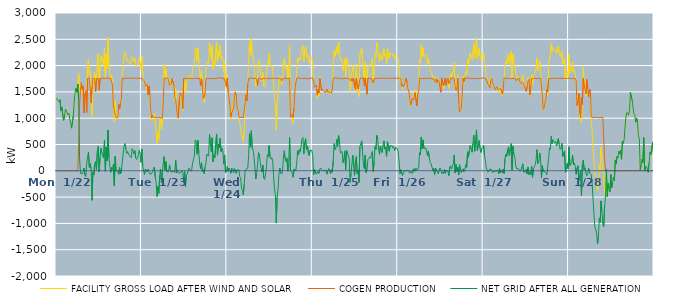
| Category | FACILITY GROSS LOAD AFTER WIND AND SOLAR | COGEN PRODUCTION | NET GRID AFTER ALL GENERATION |
|---|---|---|---|
|  Mon  1/22 | 1385 | 0 | 1385 |
|  Mon  1/22 | 1350 | 0 | 1350 |
|  Mon  1/22 | 1354 | 0 | 1354 |
|  Mon  1/22 | 1310 | 0 | 1310 |
|  Mon  1/22 | 1353 | 0 | 1353 |
|  Mon  1/22 | 1143 | 0 | 1143 |
|  Mon  1/22 | 1215 | 0 | 1215 |
|  Mon  1/22 | 1199 | 0 | 1199 |
|  Mon  1/22 | 960 | 0 | 960 |
|  Mon  1/22 | 1016 | 0 | 1016 |
|  Mon  1/22 | 1170 | 0 | 1170 |
|  Mon  1/22 | 1148 | 0 | 1148 |
|  Mon  1/22 | 1146 | 0 | 1146 |
|  Mon  1/22 | 1063 | 0 | 1063 |
|  Mon  1/22 | 1091 | 0 | 1091 |
|  Mon  1/22 | 979 | 0 | 979 |
|  Mon  1/22 | 912 | 0 | 912 |
|  Mon  1/22 | 810 | 0 | 810 |
|  Mon  1/22 | 827 | 0 | 827 |
|  Mon  1/22 | 1047 | 0 | 1047 |
|  Mon  1/22 | 1327 | 0 | 1327 |
|  Mon  1/22 | 1489 | 0 | 1489 |
|  Mon  1/22 | 1569 | 0 | 1569 |
|  Mon  1/22 | 1495 | 0 | 1495 |
|  Mon  1/22 | 1648 | 0 | 1648 |
|  Mon  1/22 | 1852 | 531 | 1321 |
|  Mon  1/22 | 1490 | 1260 | 230 |
|  Mon  1/22 | 1492 | 1540 | -48 |
|  Mon  1/22 | 1647 | 1676 | -29 |
|  Mon  1/22 | 1485 | 1541 | -56 |
|  Mon  1/22 | 1596 | 1604 | -8 |
|  Mon  1/22 | 1150 | 1098 | 52 |
|  Mon  1/22 | 1390 | 1471 | -81 |
|  Mon  1/22 | 1408 | 1521 | -113 |
|  Mon  1/22 | 1248 | 1110 | 138 |
|  Mon  1/22 | 2019 | 1758 | 261 |
|  Mon  1/22 | 2116 | 1761 | 355 |
|  Mon  1/22 | 1827 | 1762 | 65 |
|  Mon  1/22 | 1892 | 1755 | 137 |
|  Mon  1/22 | 1323 | 1287 | 36 |
|  Mon  1/22 | 1034 | 1597 | -563 |
|  Mon  1/22 | 1738 | 1760 | -22 |
|  Mon  1/22 | 1687 | 1763 | -76 |
|  Mon  1/22 | 1879 | 1754 | 125 |
|  Mon  1/22 | 1680 | 1503 | 177 |
|  Mon  1/22 | 1780 | 1754 | 26 |
|  Mon  1/22 | 2146 | 1763 | 383 |
|  Mon  1/22 | 2225 | 1757 | 468 |
|  Mon  1/22 | 1512 | 1531 | -19 |
|  Mon  1/22 | 2003 | 1753 | 250 |
|  Mon  1/22 | 2180 | 1751 | 429 |
|  Mon  1/22 | 2093 | 1756 | 337 |
|  Mon  1/22 | 2115 | 1760 | 355 |
|  Mon  1/22 | 2004 | 1762 | 242 |
|  Mon  1/22 | 2325 | 1749 | 576 |
|  Mon  1/22 | 1748 | 1756 | -8 |
|  Mon  1/22 | 2215 | 1762 | 453 |
|  Mon  1/22 | 1952 | 1760 | 192 |
|  Mon  1/22 | 2530 | 1754 | 776 |
|  Mon  1/22 | 1993 | 1755 | 238 |
|  Mon  1/22 | 1852 | 1754 | 98 |
|  Mon  1/22 | 1731 | 1760 | -29 |
|  Mon  1/22 | 1819 | 1756 | 63 |
|  Mon  1/22 | 1656 | 1629 | 27 |
|  Mon  1/22 | 1359 | 1232 | 127 |
|  Mon  1/22 | 932 | 1218 | -286 |
|  Mon  1/22 | 1329 | 1057 | 272 |
|  Mon  1/22 | 1012 | 1012 | 0 |
|  Mon  1/22 | 1004 | 1017 | -13 |
|  Mon  1/22 | 1002 | 1017 | -15 |
|  Mon  1/22 | 1202 | 1269 | -67 |
|  Mon  1/22 | 1240 | 1177 | 63 |
|  Mon  1/22 | 1236 | 1295 | -59 |
|  Mon  1/22 | 1386 | 1376 | 10 |
|  Mon  1/22 | 1930 | 1762 | 168 |
|  Mon  1/22 | 1901 | 1749 | 152 |
|  Mon  1/22 | 2225 | 1755 | 470 |
|  Mon  1/22 | 2263 | 1747 | 516 |
|  Mon  1/22 | 2171 | 1759 | 412 |
|  Mon  1/22 | 2084 | 1756 | 328 |
|  Mon  1/22 | 2124 | 1759 | 365 |
|  Mon  1/22 | 2065 | 1755 | 310 |
|  Mon  1/22 | 2077 | 1760 | 317 |
|  Mon  1/22 | 2026 | 1756 | 270 |
|  Mon  1/22 | 2011 | 1763 | 248 |
|  Mon  1/22 | 2179 | 1759 | 420 |
|  Mon  1/22 | 2157 | 1761 | 396 |
|  Mon  1/22 | 2074 | 1752 | 322 |
|  Mon  1/22 | 2139 | 1755 | 384 |
|  Mon  1/22 | 2009 | 1760 | 249 |
|  Mon  1/22 | 1974 | 1759 | 215 |
|  Mon  1/22 | 2004 | 1762 | 242 |
|  Mon  1/22 | 2068 | 1761 | 307 |
|  Mon  1/22 | 2142 | 1756 | 386 |
|  Mon  1/22 | 2085 | 1757 | 328 |
|  Mon  1/22 | 1917 | 1757 | 160 |
|  Tue  1/23 | 2176 | 1761 | 415 |
|  Tue  1/23 | 1845 | 1755 | 90 |
|  Tue  1/23 | 1713 | 1722 | -9 |
|  Tue  1/23 | 1619 | 1688 | -69 |
|  Tue  1/23 | 1642 | 1607 | 35 |
|  Tue  1/23 | 1615 | 1610 | 5 |
|  Tue  1/23 | 1622 | 1644 | -22 |
|  Tue  1/23 | 1477 | 1443 | 34 |
|  Tue  1/23 | 1587 | 1612 | -25 |
|  Tue  1/23 | 1383 | 1448 | -65 |
|  Tue  1/23 | 1084 | 1147 | -63 |
|  Tue  1/23 | 951 | 1003 | -52 |
|  Tue  1/23 | 1042 | 1051 | -9 |
|  Tue  1/23 | 1014 | 1025 | -11 |
|  Tue  1/23 | 1090 | 1018 | 72 |
|  Tue  1/23 | 900 | 1017 | -117 |
|  Tue  1/23 | 796 | 1020 | -224 |
|  Tue  1/23 | 515 | 1004 | -489 |
|  Tue  1/23 | 718 | 1018 | -300 |
|  Tue  1/23 | 585 | 1013 | -428 |
|  Tue  1/23 | 904 | 1006 | -102 |
|  Tue  1/23 | 1042 | 1009 | 33 |
|  Tue  1/23 | 780 | 1012 | -232 |
|  Tue  1/23 | 974 | 1000 | -26 |
|  Tue  1/23 | 1242 | 1268 | -26 |
|  Tue  1/23 | 2030 | 1761 | 269 |
|  Tue  1/23 | 1766 | 1752 | 14 |
|  Tue  1/23 | 1933 | 1760 | 173 |
|  Tue  1/23 | 1741 | 1756 | -15 |
|  Tue  1/23 | 1765 | 1761 | 4 |
|  Tue  1/23 | 1708 | 1727 | -19 |
|  Tue  1/23 | 1741 | 1628 | 113 |
|  Tue  1/23 | 1657 | 1628 | 29 |
|  Tue  1/23 | 1623 | 1650 | -27 |
|  Tue  1/23 | 1707 | 1751 | -44 |
|  Tue  1/23 | 1744 | 1750 | -6 |
|  Tue  1/23 | 1629 | 1624 | 5 |
|  Tue  1/23 | 1357 | 1395 | -38 |
|  Tue  1/23 | 1563 | 1361 | 202 |
|  Tue  1/23 | 1141 | 1181 | -40 |
|  Tue  1/23 | 1060 | 1043 | 17 |
|  Tue  1/23 | 971 | 1005 | -34 |
|  Tue  1/23 | 1312 | 1327 | -15 |
|  Tue  1/23 | 1437 | 1486 | -49 |
|  Tue  1/23 | 1415 | 1477 | -62 |
|  Tue  1/23 | 1431 | 1428 | 3 |
|  Tue  1/23 | 1148 | 1181 | -33 |
|  Tue  1/23 | 1549 | 1756 | -207 |
|  Tue  1/23 | 1748 | 1755 | -7 |
|  Tue  1/23 | 1457 | 1753 | -296 |
|  Tue  1/23 | 1672 | 1758 | -86 |
|  Tue  1/23 | 1659 | 1751 | -92 |
|  Tue  1/23 | 1755 | 1763 | -8 |
|  Tue  1/23 | 1820 | 1766 | 54 |
|  Tue  1/23 | 1827 | 1764 | 63 |
|  Tue  1/23 | 1746 | 1753 | -7 |
|  Tue  1/23 | 1777 | 1752 | 25 |
|  Tue  1/23 | 1903 | 1751 | 152 |
|  Tue  1/23 | 1966 | 1758 | 208 |
|  Tue  1/23 | 2046 | 1753 | 293 |
|  Tue  1/23 | 2341 | 1754 | 587 |
|  Tue  1/23 | 2301 | 1757 | 544 |
|  Tue  1/23 | 2081 | 1767 | 314 |
|  Tue  1/23 | 2334 | 1753 | 581 |
|  Tue  1/23 | 2092 | 1755 | 337 |
|  Tue  1/23 | 1890 | 1760 | 130 |
|  Tue  1/23 | 1657 | 1616 | 41 |
|  Tue  1/23 | 1903 | 1749 | 154 |
|  Tue  1/23 | 1590 | 1602 | -12 |
|  Tue  1/23 | 1392 | 1367 | 25 |
|  Tue  1/23 | 1296 | 1352 | -56 |
|  Tue  1/23 | 1542 | 1469 | 73 |
|  Tue  1/23 | 1905 | 1751 | 154 |
|  Tue  1/23 | 2078 | 1757 | 321 |
|  Tue  1/23 | 2073 | 1752 | 321 |
|  Tue  1/23 | 2036 | 1758 | 278 |
|  Tue  1/23 | 2442 | 1750 | 692 |
|  Tue  1/23 | 2263 | 1755 | 508 |
|  Tue  1/23 | 2119 | 1757 | 362 |
|  Tue  1/23 | 2380 | 1754 | 626 |
|  Tue  1/23 | 1925 | 1754 | 171 |
|  Tue  1/23 | 2052 | 1756 | 296 |
|  Tue  1/23 | 2003 | 1752 | 251 |
|  Tue  1/23 | 2016 | 1755 | 261 |
|  Tue  1/23 | 2455 | 1759 | 696 |
|  Tue  1/23 | 2053 | 1756 | 297 |
|  Tue  1/23 | 2268 | 1763 | 505 |
|  Tue  1/23 | 2194 | 1754 | 440 |
|  Tue  1/23 | 2385 | 1768 | 617 |
|  Tue  1/23 | 2123 | 1757 | 366 |
|  Tue  1/23 | 2181 | 1756 | 425 |
|  Tue  1/23 | 2147 | 1758 | 389 |
|  Tue  1/23 | 1888 | 1762 | 126 |
|  Tue  1/23 | 2061 | 1759 | 302 |
|  Tue  1/23 | 1639 | 1676 | -37 |
|  Tue  1/23 | 1580 | 1595 | -15 |
|  Wed  1/24 | 1841 | 1760 | 81 |
|  Wed  1/24 | 1487 | 1496 | -9 |
|  Wed  1/24 | 1437 | 1386 | 51 |
|  Wed  1/24 | 1254 | 1243 | 11 |
|  Wed  1/24 | 976 | 1023 | -47 |
|  Wed  1/24 | 1153 | 1101 | 52 |
|  Wed  1/24 | 1173 | 1149 | 24 |
|  Wed  1/24 | 1156 | 1192 | -36 |
|  Wed  1/24 | 1443 | 1400 | 43 |
|  Wed  1/24 | 1510 | 1495 | 15 |
|  Wed  1/24 | 1386 | 1433 | -47 |
|  Wed  1/24 | 1209 | 1191 | 18 |
|  Wed  1/24 | 1184 | 1162 | 22 |
|  Wed  1/24 | 1057 | 1040 | 17 |
|  Wed  1/24 | 898 | 1008 | -110 |
|  Wed  1/24 | 880 | 1010 | -130 |
|  Wed  1/24 | 684 | 1020 | -336 |
|  Wed  1/24 | 640 | 1014 | -374 |
|  Wed  1/24 | 552 | 1013 | -461 |
|  Wed  1/24 | 749 | 1002 | -253 |
|  Wed  1/24 | 1275 | 1280 | -5 |
|  Wed  1/24 | 1484 | 1452 | 32 |
|  Wed  1/24 | 1374 | 1334 | 40 |
|  Wed  1/24 | 1700 | 1650 | 50 |
|  Wed  1/24 | 2069 | 1761 | 308 |
|  Wed  1/24 | 2463 | 1758 | 705 |
|  Wed  1/24 | 2210 | 1760 | 450 |
|  Wed  1/24 | 2519 | 1758 | 761 |
|  Wed  1/24 | 2184 | 1760 | 424 |
|  Wed  1/24 | 2157 | 1763 | 394 |
|  Wed  1/24 | 2019 | 1754 | 265 |
|  Wed  1/24 | 1843 | 1762 | 81 |
|  Wed  1/24 | 1603 | 1760 | -157 |
|  Wed  1/24 | 1671 | 1728 | -57 |
|  Wed  1/24 | 1732 | 1621 | 111 |
|  Wed  1/24 | 2102 | 1755 | 347 |
|  Wed  1/24 | 2074 | 1755 | 319 |
|  Wed  1/24 | 1913 | 1759 | 154 |
|  Wed  1/24 | 1803 | 1755 | 48 |
|  Wed  1/24 | 1708 | 1731 | -23 |
|  Wed  1/24 | 1871 | 1761 | 110 |
|  Wed  1/24 | 1616 | 1753 | -137 |
|  Wed  1/24 | 1595 | 1758 | -163 |
|  Wed  1/24 | 1704 | 1762 | -58 |
|  Wed  1/24 | 1815 | 1748 | 67 |
|  Wed  1/24 | 2057 | 1752 | 305 |
|  Wed  1/24 | 2023 | 1756 | 267 |
|  Wed  1/24 | 2239 | 1760 | 479 |
|  Wed  1/24 | 2018 | 1750 | 268 |
|  Wed  1/24 | 1973 | 1752 | 221 |
|  Wed  1/24 | 2011 | 1762 | 249 |
|  Wed  1/24 | 1953 | 1763 | 190 |
|  Wed  1/24 | 1677 | 1760 | -83 |
|  Wed  1/24 | 1409 | 1756 | -347 |
|  Wed  1/24 | 1304 | 1756 | -452 |
|  Wed  1/24 | 770 | 1764 | -994 |
|  Wed  1/24 | 1259 | 1762 | -503 |
|  Wed  1/24 | 1412 | 1762 | -350 |
|  Wed  1/24 | 1688 | 1757 | -69 |
|  Wed  1/24 | 1807 | 1756 | 51 |
|  Wed  1/24 | 1713 | 1753 | -40 |
|  Wed  1/24 | 1640 | 1703 | -63 |
|  Wed  1/24 | 1733 | 1748 | -15 |
|  Wed  1/24 | 2002 | 1762 | 240 |
|  Wed  1/24 | 2143 | 1763 | 380 |
|  Wed  1/24 | 1985 | 1756 | 229 |
|  Wed  1/24 | 1931 | 1758 | 173 |
|  Wed  1/24 | 1988 | 1747 | 241 |
|  Wed  1/24 | 1747 | 1753 | -6 |
|  Wed  1/24 | 1871 | 1755 | 116 |
|  Wed  1/24 | 2392 | 1761 | 631 |
|  Wed  1/24 | 1023 | 1017 | 6 |
|  Wed  1/24 | 1025 | 1011 | 14 |
|  Wed  1/24 | 1027 | 1067 | -40 |
|  Wed  1/24 | 894 | 1016 | -122 |
|  Wed  1/24 | 1237 | 1206 | 31 |
|  Wed  1/24 | 1551 | 1536 | 15 |
|  Wed  1/24 | 1679 | 1669 | 10 |
|  Wed  1/24 | 1902 | 1759 | 143 |
|  Wed  1/24 | 2142 | 1760 | 382 |
|  Wed  1/24 | 2068 | 1769 | 299 |
|  Wed  1/24 | 2160 | 1755 | 405 |
|  Wed  1/24 | 2117 | 1752 | 365 |
|  Wed  1/24 | 2224 | 1750 | 474 |
|  Wed  1/24 | 2367 | 1759 | 608 |
|  Wed  1/24 | 2388 | 1756 | 632 |
|  Wed  1/24 | 2074 | 1752 | 322 |
|  Wed  1/24 | 2299 | 1756 | 543 |
|  Wed  1/24 | 2367 | 1759 | 608 |
|  Wed  1/24 | 2168 | 1759 | 409 |
|  Wed  1/24 | 2218 | 1751 | 467 |
|  Wed  1/24 | 2104 | 1761 | 343 |
|  Wed  1/24 | 2044 | 1754 | 290 |
|  Wed  1/24 | 2156 | 1769 | 387 |
|  Wed  1/24 | 2131 | 1763 | 368 |
|  Wed  1/24 | 2153 | 1761 | 392 |
|  Thu  1/25 | 2054 | 1764 | 290 |
|  Thu  1/25 | 1631 | 1710 | -79 |
|  Thu  1/25 | 1614 | 1587 | 27 |
|  Thu  1/25 | 1619 | 1588 | 31 |
|  Thu  1/25 | 1568 | 1630 | -62 |
|  Thu  1/25 | 1388 | 1437 | -49 |
|  Thu  1/25 | 1535 | 1546 | -11 |
|  Thu  1/25 | 1424 | 1477 | -53 |
|  Thu  1/25 | 1792 | 1758 | 34 |
|  Thu  1/25 | 1805 | 1751 | 54 |
|  Thu  1/25 | 1544 | 1517 | 27 |
|  Thu  1/25 | 1555 | 1548 | 7 |
|  Thu  1/25 | 1533 | 1537 | -4 |
|  Thu  1/25 | 1510 | 1516 | -6 |
|  Thu  1/25 | 1470 | 1481 | -11 |
|  Thu  1/25 | 1528 | 1511 | 17 |
|  Thu  1/25 | 1491 | 1555 | -64 |
|  Thu  1/25 | 1489 | 1495 | -6 |
|  Thu  1/25 | 1525 | 1481 | 44 |
|  Thu  1/25 | 1521 | 1505 | 16 |
|  Thu  1/25 | 1447 | 1507 | -60 |
|  Thu  1/25 | 1492 | 1470 | 22 |
|  Thu  1/25 | 1526 | 1552 | -26 |
|  Thu  1/25 | 1942 | 1758 | 184 |
|  Thu  1/25 | 2273 | 1756 | 517 |
|  Thu  1/25 | 2169 | 1767 | 402 |
|  Thu  1/25 | 2187 | 1761 | 426 |
|  Thu  1/25 | 2354 | 1760 | 594 |
|  Thu  1/25 | 2216 | 1755 | 461 |
|  Thu  1/25 | 2442 | 1765 | 677 |
|  Thu  1/25 | 2313 | 1744 | 569 |
|  Thu  1/25 | 2104 | 1761 | 343 |
|  Thu  1/25 | 2113 | 1754 | 359 |
|  Thu  1/25 | 2131 | 1766 | 365 |
|  Thu  1/25 | 1903 | 1749 | 154 |
|  Thu  1/25 | 1981 | 1761 | 220 |
|  Thu  1/25 | 2138 | 1759 | 379 |
|  Thu  1/25 | 1786 | 1764 | 22 |
|  Thu  1/25 | 2147 | 1761 | 386 |
|  Thu  1/25 | 2092 | 1756 | 336 |
|  Thu  1/25 | 2087 | 1757 | 330 |
|  Thu  1/25 | 1993 | 1759 | 234 |
|  Thu  1/25 | 1508 | 1728 | -220 |
|  Thu  1/25 | 1659 | 1705 | -46 |
|  Thu  1/25 | 1883 | 1762 | 121 |
|  Thu  1/25 | 1998 | 1702 | 296 |
|  Thu  1/25 | 1839 | 1760 | 79 |
|  Thu  1/25 | 1527 | 1614 | -87 |
|  Thu  1/25 | 1728 | 1541 | 187 |
|  Thu  1/25 | 2031 | 1759 | 272 |
|  Thu  1/25 | 1560 | 1617 | -57 |
|  Thu  1/25 | 1564 | 1554 | 10 |
|  Thu  1/25 | 1409 | 1632 | -223 |
|  Thu  1/25 | 2213 | 1753 | 460 |
|  Thu  1/25 | 2205 | 1760 | 445 |
|  Thu  1/25 | 2330 | 1761 | 569 |
|  Thu  1/25 | 2120 | 1754 | 366 |
|  Thu  1/25 | 1861 | 1766 | 95 |
|  Thu  1/25 | 1655 | 1614 | 41 |
|  Thu  1/25 | 2061 | 1765 | 296 |
|  Thu  1/25 | 1721 | 1758 | -37 |
|  Thu  1/25 | 1480 | 1455 | 25 |
|  Thu  1/25 | 1975 | 1764 | 211 |
|  Thu  1/25 | 1988 | 1755 | 233 |
|  Thu  1/25 | 2019 | 1755 | 264 |
|  Thu  1/25 | 1997 | 1758 | 239 |
|  Thu  1/25 | 1982 | 1758 | 224 |
|  Thu  1/25 | 2129 | 1763 | 366 |
|  Thu  1/25 | 1647 | 1665 | -18 |
|  Thu  1/25 | 1929 | 1750 | 179 |
|  Thu  1/25 | 2218 | 1758 | 460 |
|  Thu  1/25 | 2165 | 1761 | 404 |
|  Thu  1/25 | 2432 | 1761 | 671 |
|  Thu  1/25 | 2359 | 1754 | 605 |
|  Thu  1/25 | 2175 | 1762 | 413 |
|  Thu  1/25 | 2072 | 1759 | 313 |
|  Thu  1/25 | 2227 | 1756 | 471 |
|  Thu  1/25 | 2147 | 1760 | 387 |
|  Thu  1/25 | 2099 | 1752 | 347 |
|  Thu  1/25 | 2253 | 1762 | 491 |
|  Thu  1/25 | 2324 | 1754 | 570 |
|  Thu  1/25 | 2177 | 1762 | 415 |
|  Thu  1/25 | 2212 | 1759 | 453 |
|  Thu  1/25 | 2031 | 1755 | 276 |
|  Thu  1/25 | 2320 | 1761 | 559 |
|  Thu  1/25 | 2336 | 1760 | 576 |
|  Thu  1/25 | 2137 | 1764 | 373 |
|  Thu  1/25 | 2239 | 1761 | 478 |
|  Thu  1/25 | 2257 | 1762 | 495 |
|  Thu  1/25 | 2235 | 1753 | 482 |
|  Thu  1/25 | 2190 | 1756 | 434 |
|  Thu  1/25 | 2223 | 1765 | 458 |
|  Thu  1/25 | 2134 | 1751 | 383 |
|  Thu  1/25 | 2203 | 1762 | 441 |
|  Thu  1/25 | 2202 | 1754 | 448 |
|  Thu  1/25 | 2181 | 1755 | 426 |
|  Fri  1/26 | 2129 | 1764 | 365 |
|  Fri  1/26 | 1957 | 1764 | 193 |
|  Fri  1/26 | 1702 | 1756 | -54 |
|  Fri  1/26 | 1781 | 1759 | 22 |
|  Fri  1/26 | 1636 | 1603 | 33 |
|  Fri  1/26 | 1552 | 1639 | -87 |
|  Fri  1/26 | 1552 | 1591 | -39 |
|  Fri  1/26 | 1603 | 1593 | 10 |
|  Fri  1/26 | 1724 | 1696 | 28 |
|  Fri  1/26 | 1750 | 1758 | -8 |
|  Fri  1/26 | 1655 | 1675 | -20 |
|  Fri  1/26 | 1570 | 1553 | 17 |
|  Fri  1/26 | 1503 | 1506 | -3 |
|  Fri  1/26 | 1330 | 1375 | -45 |
|  Fri  1/26 | 1245 | 1254 | -9 |
|  Fri  1/26 | 1317 | 1327 | -10 |
|  Fri  1/26 | 1327 | 1377 | -50 |
|  Fri  1/26 | 1376 | 1339 | 37 |
|  Fri  1/26 | 1384 | 1397 | -13 |
|  Fri  1/26 | 1531 | 1483 | 48 |
|  Fri  1/26 | 1472 | 1472 | 0 |
|  Fri  1/26 | 1280 | 1236 | 44 |
|  Fri  1/26 | 1478 | 1454 | 24 |
|  Fri  1/26 | 1556 | 1508 | 48 |
|  Fri  1/26 | 2109 | 1763 | 346 |
|  Fri  1/26 | 2059 | 1757 | 302 |
|  Fri  1/26 | 2398 | 1754 | 644 |
|  Fri  1/26 | 2173 | 1754 | 419 |
|  Fri  1/26 | 2340 | 1752 | 588 |
|  Fri  1/26 | 2173 | 1749 | 424 |
|  Fri  1/26 | 2179 | 1754 | 425 |
|  Fri  1/26 | 2190 | 1755 | 435 |
|  Fri  1/26 | 2210 | 1756 | 454 |
|  Fri  1/26 | 2037 | 1749 | 288 |
|  Fri  1/26 | 2134 | 1760 | 374 |
|  Fri  1/26 | 2000 | 1750 | 250 |
|  Fri  1/26 | 1917 | 1758 | 159 |
|  Fri  1/26 | 1887 | 1753 | 134 |
|  Fri  1/26 | 1874 | 1751 | 123 |
|  Fri  1/26 | 1765 | 1761 | 4 |
|  Fri  1/26 | 1795 | 1748 | 47 |
|  Fri  1/26 | 1688 | 1758 | -70 |
|  Fri  1/26 | 1736 | 1684 | 52 |
|  Fri  1/26 | 1782 | 1754 | 28 |
|  Fri  1/26 | 1693 | 1676 | 17 |
|  Fri  1/26 | 1666 | 1724 | -58 |
|  Fri  1/26 | 1701 | 1697 | 4 |
|  Fri  1/26 | 1634 | 1580 | 54 |
|  Fri  1/26 | 1514 | 1493 | 21 |
|  Fri  1/26 | 1715 | 1766 | -51 |
|  Fri  1/26 | 1746 | 1765 | -19 |
|  Fri  1/26 | 1559 | 1617 | -58 |
|  Fri  1/26 | 1660 | 1634 | 26 |
|  Fri  1/26 | 1714 | 1762 | -48 |
|  Fri  1/26 | 1637 | 1627 | 10 |
|  Fri  1/26 | 1724 | 1729 | -5 |
|  Fri  1/26 | 1751 | 1763 | -12 |
|  Fri  1/26 | 1564 | 1655 | -91 |
|  Fri  1/26 | 1766 | 1692 | 74 |
|  Fri  1/26 | 1851 | 1757 | 94 |
|  Fri  1/26 | 1781 | 1749 | 32 |
|  Fri  1/26 | 1854 | 1763 | 91 |
|  Fri  1/26 | 1905 | 1765 | 140 |
|  Fri  1/26 | 2056 | 1755 | 301 |
|  Fri  1/26 | 1565 | 1608 | -43 |
|  Fri  1/26 | 1649 | 1531 | 118 |
|  Fri  1/26 | 1564 | 1575 | -11 |
|  Fri  1/26 | 1826 | 1761 | 65 |
|  Fri  1/26 | 1219 | 1300 | -81 |
|  Fri  1/26 | 1238 | 1122 | 116 |
|  Fri  1/26 | 1175 | 1156 | 19 |
|  Fri  1/26 | 1141 | 1180 | -39 |
|  Fri  1/26 | 1417 | 1459 | -42 |
|  Fri  1/26 | 1799 | 1759 | 40 |
|  Fri  1/26 | 1677 | 1696 | -19 |
|  Fri  1/26 | 1780 | 1766 | 14 |
|  Fri  1/26 | 1883 | 1766 | 117 |
|  Fri  1/26 | 1825 | 1759 | 66 |
|  Fri  1/26 | 2115 | 1754 | 361 |
|  Fri  1/26 | 2023 | 1765 | 258 |
|  Fri  1/26 | 2154 | 1766 | 388 |
|  Fri  1/26 | 2242 | 1753 | 489 |
|  Fri  1/26 | 2171 | 1754 | 417 |
|  Fri  1/26 | 2104 | 1751 | 353 |
|  Fri  1/26 | 2278 | 1760 | 518 |
|  Fri  1/26 | 2428 | 1749 | 679 |
|  Fri  1/26 | 2130 | 1759 | 371 |
|  Fri  1/26 | 2331 | 1757 | 574 |
|  Fri  1/26 | 2534 | 1756 | 778 |
|  Fri  1/26 | 2139 | 1754 | 385 |
|  Fri  1/26 | 2242 | 1761 | 481 |
|  Fri  1/26 | 2326 | 1751 | 575 |
|  Fri  1/26 | 2188 | 1753 | 435 |
|  Fri  1/26 | 2108 | 1759 | 349 |
|  Fri  1/26 | 2188 | 1765 | 423 |
|  Fri  1/26 | 2208 | 1764 | 444 |
|  Sat  1/27 | 2252 | 1764 | 488 |
|  Sat  1/27 | 2058 | 1764 | 294 |
|  Sat  1/27 | 1945 | 1756 | 189 |
|  Sat  1/27 | 1801 | 1748 | 53 |
|  Sat  1/27 | 1756 | 1744 | 12 |
|  Sat  1/27 | 1617 | 1642 | -25 |
|  Sat  1/27 | 1587 | 1625 | -38 |
|  Sat  1/27 | 1606 | 1572 | 34 |
|  Sat  1/27 | 1754 | 1713 | 41 |
|  Sat  1/27 | 1784 | 1760 | 24 |
|  Sat  1/27 | 1654 | 1684 | -30 |
|  Sat  1/27 | 1596 | 1625 | -29 |
|  Sat  1/27 | 1582 | 1593 | -11 |
|  Sat  1/27 | 1552 | 1544 | 8 |
|  Sat  1/27 | 1547 | 1557 | -10 |
|  Sat  1/27 | 1586 | 1598 | -12 |
|  Sat  1/27 | 1558 | 1545 | 13 |
|  Sat  1/27 | 1496 | 1557 | -61 |
|  Sat  1/27 | 1582 | 1541 | 41 |
|  Sat  1/27 | 1532 | 1572 | -40 |
|  Sat  1/27 | 1535 | 1533 | 2 |
|  Sat  1/27 | 1421 | 1458 | -37 |
|  Sat  1/27 | 1576 | 1543 | 33 |
|  Sat  1/27 | 1707 | 1760 | -53 |
|  Sat  1/27 | 1985 | 1756 | 229 |
|  Sat  1/27 | 2082 | 1764 | 318 |
|  Sat  1/27 | 2030 | 1758 | 272 |
|  Sat  1/27 | 2154 | 1753 | 401 |
|  Sat  1/27 | 2221 | 1765 | 456 |
|  Sat  1/27 | 2041 | 1753 | 288 |
|  Sat  1/27 | 2166 | 1749 | 417 |
|  Sat  1/27 | 2272 | 1754 | 518 |
|  Sat  1/27 | 1763 | 1752 | 11 |
|  Sat  1/27 | 2222 | 1755 | 467 |
|  Sat  1/27 | 2078 | 1761 | 317 |
|  Sat  1/27 | 2021 | 1759 | 262 |
|  Sat  1/27 | 1859 | 1751 | 108 |
|  Sat  1/27 | 1750 | 1709 | 41 |
|  Sat  1/27 | 1773 | 1750 | 23 |
|  Sat  1/27 | 1799 | 1758 | 41 |
|  Sat  1/27 | 1786 | 1753 | 33 |
|  Sat  1/27 | 1675 | 1683 | -8 |
|  Sat  1/27 | 1671 | 1658 | 13 |
|  Sat  1/27 | 1647 | 1648 | -1 |
|  Sat  1/27 | 1821 | 1688 | 133 |
|  Sat  1/27 | 1658 | 1683 | -25 |
|  Sat  1/27 | 1584 | 1597 | -13 |
|  Sat  1/27 | 1581 | 1600 | -19 |
|  Sat  1/27 | 1537 | 1507 | 30 |
|  Sat  1/27 | 1552 | 1611 | -59 |
|  Sat  1/27 | 1783 | 1710 | 73 |
|  Sat  1/27 | 1671 | 1741 | -70 |
|  Sat  1/27 | 1417 | 1440 | -23 |
|  Sat  1/27 | 1524 | 1600 | -76 |
|  Sat  1/27 | 1838 | 1753 | 85 |
|  Sat  1/27 | 1636 | 1758 | -122 |
|  Sat  1/27 | 1780 | 1752 | 28 |
|  Sat  1/27 | 1838 | 1758 | 80 |
|  Sat  1/27 | 1871 | 1760 | 111 |
|  Sat  1/27 | 1964 | 1756 | 208 |
|  Sat  1/27 | 2149 | 1748 | 401 |
|  Sat  1/27 | 1899 | 1764 | 135 |
|  Sat  1/27 | 1928 | 1759 | 169 |
|  Sat  1/27 | 2099 | 1760 | 339 |
|  Sat  1/27 | 1991 | 1761 | 230 |
|  Sat  1/27 | 1501 | 1632 | -131 |
|  Sat  1/27 | 1502 | 1401 | 101 |
|  Sat  1/27 | 1153 | 1164 | -11 |
|  Sat  1/27 | 1177 | 1195 | -18 |
|  Sat  1/27 | 1276 | 1292 | -16 |
|  Sat  1/27 | 1300 | 1339 | -39 |
|  Sat  1/27 | 1474 | 1549 | -75 |
|  Sat  1/27 | 1432 | 1499 | -67 |
|  Sat  1/27 | 1960 | 1749 | 211 |
|  Sat  1/27 | 2177 | 1747 | 430 |
|  Sat  1/27 | 2155 | 1750 | 405 |
|  Sat  1/27 | 2420 | 1764 | 656 |
|  Sat  1/27 | 2274 | 1759 | 515 |
|  Sat  1/27 | 2345 | 1756 | 589 |
|  Sat  1/27 | 2310 | 1756 | 554 |
|  Sat  1/27 | 2287 | 1756 | 531 |
|  Sat  1/27 | 2312 | 1754 | 558 |
|  Sat  1/27 | 2229 | 1756 | 473 |
|  Sat  1/27 | 2242 | 1761 | 481 |
|  Sat  1/27 | 2372 | 1760 | 612 |
|  Sat  1/27 | 2264 | 1760 | 504 |
|  Sat  1/27 | 2169 | 1763 | 406 |
|  Sat  1/27 | 2186 | 1759 | 427 |
|  Sat  1/27 | 2276 | 1751 | 525 |
|  Sat  1/27 | 2031 | 1759 | 272 |
|  Sat  1/27 | 2091 | 1751 | 340 |
|  Sat  1/27 | 2132 | 1754 | 378 |
|  Sat  1/27 | 1726 | 1753 | -27 |
|  Sat  1/27 | 1837 | 1754 | 83 |
|  Sat  1/27 | 1894 | 1753 | 141 |
|  Sat  1/27 | 1796 | 1761 | 35 |
|  Sun  1/28 | 2217 | 1762 | 455 |
|  Sun  1/28 | 1855 | 1756 | 99 |
|  Sun  1/28 | 1861 | 1764 | 97 |
|  Sun  1/28 | 1915 | 1751 | 164 |
|  Sun  1/28 | 2062 | 1761 | 301 |
|  Sun  1/28 | 1877 | 1759 | 118 |
|  Sun  1/28 | 1914 | 1764 | 150 |
|  Sun  1/28 | 1837 | 1754 | 83 |
|  Sun  1/28 | 1643 | 1710 | -67 |
|  Sun  1/28 | 1292 | 1243 | 49 |
|  Sun  1/28 | 1423 | 1327 | 96 |
|  Sun  1/28 | 1292 | 1474 | -182 |
|  Sun  1/28 | 1022 | 1108 | -86 |
|  Sun  1/28 | 1018 | 1017 | 1 |
|  Sun  1/28 | 923 | 1393 | -470 |
|  Sun  1/28 | 1376 | 1263 | 113 |
|  Sun  1/28 | 1967 | 1762 | 205 |
|  Sun  1/28 | 1659 | 1644 | 15 |
|  Sun  1/28 | 1703 | 1645 | 58 |
|  Sun  1/28 | 1416 | 1463 | -47 |
|  Sun  1/28 | 1643 | 1735 | -92 |
|  Sun  1/28 | 1517 | 1567 | -50 |
|  Sun  1/28 | 1454 | 1407 | 47 |
|  Sun  1/28 | 1523 | 1555 | -32 |
|  Sun  1/28 | 1473 | 1513 | -40 |
|  Sun  1/28 | 972 | 1047 | -75 |
|  Sun  1/28 | 767 | 1010 | -243 |
|  Sun  1/28 | 462 | 1000 | -538 |
|  Sun  1/28 | 196 | 1011 | -815 |
|  Sun  1/28 | -48 | 1009 | -1057 |
|  Sun  1/28 | -35 | 1018 | -1053 |
|  Sun  1/28 | -174 | 1006 | -1180 |
|  Sun  1/28 | -381 | 1012 | -1393 |
|  Sun  1/28 | -248 | 1021 | -1269 |
|  Sun  1/28 | 102 | 1007 | -905 |
|  Sun  1/28 | 20 | 1003 | -983 |
|  Sun  1/28 | 445 | 1017 | -572 |
|  Sun  1/28 | 250 | 1019 | -769 |
|  Sun  1/28 | -2 | 1016 | -1018 |
|  Sun  1/28 | -50 | 1011 | -1061 |
|  Sun  1/28 | -434 | 228 | -662 |
|  Sun  1/28 | -481 | 0 | -481 |
|  Sun  1/28 | 32 | 0 | 32 |
|  Sun  1/28 | -491 | 0 | -491 |
|  Sun  1/28 | -239 | 0 | -239 |
|  Sun  1/28 | -253 | 0 | -253 |
|  Sun  1/28 | -399 | 0 | -399 |
|  Sun  1/28 | -68 | 0 | -68 |
|  Sun  1/28 | -322 | 0 | -322 |
|  Sun  1/28 | -232 | 0 | -232 |
|  Sun  1/28 | -117 | 0 | -117 |
|  Sun  1/28 | -190 | 0 | -190 |
|  Sun  1/28 | 207 | 0 | 207 |
|  Sun  1/28 | 128 | 0 | 128 |
|  Sun  1/28 | 274 | 0 | 274 |
|  Sun  1/28 | 243 | 0 | 243 |
|  Sun  1/28 | 373 | 0 | 373 |
|  Sun  1/28 | 326 | 0 | 326 |
|  Sun  1/28 | 392 | 0 | 392 |
|  Sun  1/28 | 217 | 0 | 217 |
|  Sun  1/28 | 559 | 0 | 559 |
|  Sun  1/28 | 521 | 0 | 521 |
|  Sun  1/28 | 599 | 0 | 599 |
|  Sun  1/28 | 845 | 0 | 845 |
|  Sun  1/28 | 1023 | 0 | 1023 |
|  Sun  1/28 | 1109 | 0 | 1109 |
|  Sun  1/28 | 1089 | 0 | 1089 |
|  Sun  1/28 | 1058 | 0 | 1058 |
|  Sun  1/28 | 1150 | 0 | 1150 |
|  Sun  1/28 | 1492 | 0 | 1492 |
|  Sun  1/28 | 1510 | 0 | 1510 |
|  Sun  1/28 | 1336 | 0 | 1336 |
|  Sun  1/28 | 1198 | 0 | 1198 |
|  Sun  1/28 | 1084 | 0 | 1084 |
|  Sun  1/28 | 1051 | 0 | 1051 |
|  Sun  1/28 | 924 | 0 | 924 |
|  Sun  1/28 | 1001 | 0 | 1001 |
|  Sun  1/28 | 918 | 0 | 918 |
|  Sun  1/28 | 665 | 0 | 665 |
|  Sun  1/28 | 622 | 0 | 622 |
|  Sun  1/28 | 18 | 0 | 18 |
|  Sun  1/28 | 116 | 0 | 116 |
|  Sun  1/28 | 218 | 0 | 218 |
|  Sun  1/28 | 156 | 0 | 156 |
|  Sun  1/28 | 632 | 0 | 632 |
|  Sun  1/28 | 8 | 0 | 8 |
|  Sun  1/28 | 69 | 0 | 69 |
|  Sun  1/28 | 90 | 0 | 90 |
|  Sun  1/28 | 84 | 0 | 84 |
|  Sun  1/28 | -31 | 0 | -31 |
|  Sun  1/28 | 157 | 0 | 157 |
|  Sun  1/28 | 355 | 0 | 355 |
|  Sun  1/28 | 309 | 0 | 309 |
|  Sun  1/28 | 326 | 0 | 326 |
|  Sun  1/28 | 545 | 0 | 545 |
|  Sun  1/28 | 307 | 0 | 307 |